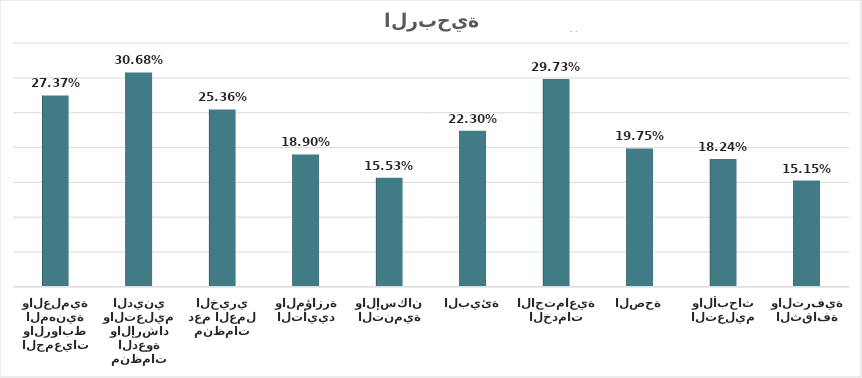
| Category | Series 0 |
|---|---|
| الثقافة والترفية | 0.152 |
| التعليم والأبحاث | 0.182 |
| الصحة | 0.198 |
| الخدمات الاجتماعية | 0.297 |
| البيئة | 0.223 |
| التنمية والإسكان | 0.155 |
| التأييد والمؤازرة | 0.189 |
| منظمات دعم العمل الخيري | 0.254 |
| منظمات الدعوة والإرشاد والتعليم الديني | 0.307 |
| الجمعيات والروابط المهنية والعلمية | 0.274 |